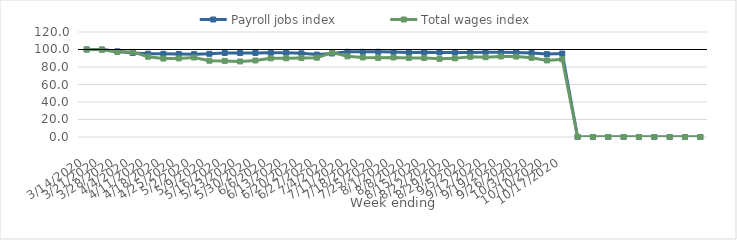
| Category | Payroll jobs index | Total wages index |
|---|---|---|
| 14/03/2020 | 100 | 100 |
| 21/03/2020 | 99.966 | 99.818 |
| 28/03/2020 | 97.928 | 97.235 |
| 04/04/2020 | 96.074 | 97.262 |
| 11/04/2020 | 95.161 | 91.761 |
| 18/04/2020 | 95.076 | 89.627 |
| 25/04/2020 | 94.858 | 89.851 |
| 02/05/2020 | 94.698 | 90.865 |
| 09/05/2020 | 95.091 | 87.17 |
| 16/05/2020 | 96.05 | 86.997 |
| 23/05/2020 | 95.941 | 86.341 |
| 30/05/2020 | 96.068 | 87.448 |
| 06/06/2020 | 96.289 | 89.9 |
| 13/06/2020 | 96.421 | 89.942 |
| 20/06/2020 | 95.591 | 90.353 |
| 27/06/2020 | 94.168 | 90.636 |
| 04/07/2020 | 95.444 | 96.561 |
| 11/07/2020 | 97.314 | 92.16 |
| 18/07/2020 | 97.315 | 90.86 |
| 25/07/2020 | 97.353 | 90.499 |
| 01/08/2020 | 97.058 | 90.896 |
| 08/08/2020 | 96.529 | 90.41 |
| 15/08/2020 | 96.837 | 90.342 |
| 22/08/2020 | 96.711 | 89.34 |
| 29/08/2020 | 96.502 | 89.866 |
| 05/09/2020 | 96.623 | 91.72 |
| 12/09/2020 | 96.902 | 91.258 |
| 19/09/2020 | 96.787 | 92.041 |
| 26/09/2020 | 96.502 | 91.911 |
| 03/10/2020 | 96.044 | 90.503 |
| 10/10/2020 | 94.744 | 87.492 |
| 17/10/2020 | 95.373 | 88.863 |